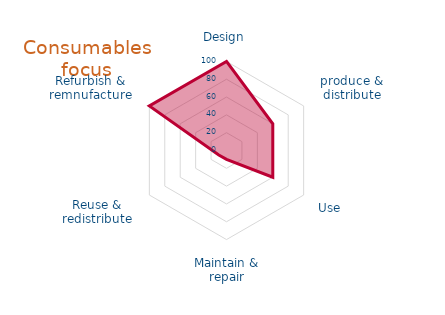
| Category | Fit your product/ service  |
|---|---|
| 0 | 100 |
| 1 | 60 |
| 2 | 60 |
| 3 | 10 |
| 4 | 10 |
| 5 | 100 |